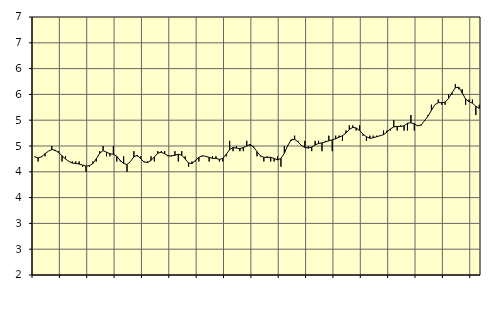
| Category | Piggar | Personliga och kulturella tjänster, SNI 90-98 |
|---|---|---|
| nan | 4.3 | 4.29 |
| 87.0 | 4.2 | 4.27 |
| 87.0 | 4.3 | 4.29 |
| 87.0 | 4.3 | 4.35 |
| nan | 4.4 | 4.4 |
| 88.0 | 4.5 | 4.43 |
| 88.0 | 4.4 | 4.42 |
| 88.0 | 4.4 | 4.37 |
| nan | 4.2 | 4.31 |
| 89.0 | 4.3 | 4.25 |
| 89.0 | 4.2 | 4.2 |
| 89.0 | 4.2 | 4.17 |
| nan | 4.2 | 4.16 |
| 90.0 | 4.2 | 4.15 |
| 90.0 | 4.1 | 4.13 |
| 90.0 | 4 | 4.11 |
| nan | 4.1 | 4.12 |
| 91.0 | 4.2 | 4.16 |
| 91.0 | 4.2 | 4.25 |
| 91.0 | 4.4 | 4.36 |
| nan | 4.5 | 4.41 |
| 92.0 | 4.3 | 4.38 |
| 92.0 | 4.3 | 4.35 |
| 92.0 | 4.5 | 4.34 |
| nan | 4.2 | 4.3 |
| 93.0 | 4.2 | 4.22 |
| 93.0 | 4.3 | 4.16 |
| 93.0 | 4 | 4.14 |
| nan | 4.2 | 4.2 |
| 94.0 | 4.4 | 4.29 |
| 94.0 | 4.3 | 4.32 |
| 94.0 | 4.3 | 4.25 |
| nan | 4.2 | 4.19 |
| 95.0 | 4.2 | 4.18 |
| 95.0 | 4.3 | 4.22 |
| 95.0 | 4.2 | 4.29 |
| nan | 4.4 | 4.36 |
| 96.0 | 4.4 | 4.38 |
| 96.0 | 4.4 | 4.35 |
| 96.0 | 4.3 | 4.31 |
| nan | 4.3 | 4.31 |
| 97.0 | 4.4 | 4.32 |
| 97.0 | 4.2 | 4.34 |
| 97.0 | 4.4 | 4.32 |
| nan | 4.3 | 4.25 |
| 98.0 | 4.1 | 4.17 |
| 98.0 | 4.2 | 4.16 |
| 98.0 | 4.2 | 4.22 |
| nan | 4.2 | 4.28 |
| 99.0 | 4.3 | 4.31 |
| 99.0 | 4.3 | 4.3 |
| 99.0 | 4.2 | 4.28 |
| nan | 4.3 | 4.26 |
| 0.0 | 4.3 | 4.26 |
| 0.0 | 4.2 | 4.24 |
| 0.0 | 4.2 | 4.26 |
| nan | 4.3 | 4.34 |
| 1.0 | 4.6 | 4.43 |
| 1.0 | 4.4 | 4.47 |
| 1.0 | 4.5 | 4.46 |
| nan | 4.4 | 4.45 |
| 2.0 | 4.4 | 4.47 |
| 2.0 | 4.6 | 4.5 |
| 2.0 | 4.5 | 4.53 |
| nan | 4.5 | 4.48 |
| 3.0 | 4.3 | 4.39 |
| 3.0 | 4.3 | 4.31 |
| 3.0 | 4.2 | 4.28 |
| nan | 4.3 | 4.28 |
| 4.0 | 4.2 | 4.28 |
| 4.0 | 4.2 | 4.26 |
| 4.0 | 4.3 | 4.23 |
| nan | 4.1 | 4.26 |
| 5.0 | 4.5 | 4.36 |
| 5.0 | 4.5 | 4.51 |
| 5.0 | 4.6 | 4.62 |
| nan | 4.7 | 4.63 |
| 6.0 | 4.6 | 4.58 |
| 6.0 | 4.5 | 4.51 |
| 6.0 | 4.6 | 4.47 |
| nan | 4.5 | 4.46 |
| 7.0 | 4.4 | 4.48 |
| 7.0 | 4.6 | 4.52 |
| 7.0 | 4.6 | 4.55 |
| nan | 4.4 | 4.56 |
| 8.0 | 4.6 | 4.58 |
| 8.0 | 4.7 | 4.6 |
| 8.0 | 4.4 | 4.62 |
| nan | 4.7 | 4.64 |
| 9.0 | 4.7 | 4.67 |
| 9.0 | 4.6 | 4.7 |
| 9.0 | 4.8 | 4.75 |
| nan | 4.9 | 4.82 |
| 10.0 | 4.9 | 4.86 |
| 10.0 | 4.8 | 4.85 |
| 10.0 | 4.9 | 4.8 |
| nan | 4.7 | 4.73 |
| 11.0 | 4.6 | 4.68 |
| 11.0 | 4.7 | 4.65 |
| 11.0 | 4.7 | 4.66 |
| nan | 4.7 | 4.68 |
| 12.0 | 4.7 | 4.7 |
| 12.0 | 4.8 | 4.72 |
| 12.0 | 4.8 | 4.77 |
| nan | 4.8 | 4.83 |
| 13.0 | 5 | 4.87 |
| 13.0 | 4.8 | 4.88 |
| 13.0 | 4.9 | 4.88 |
| nan | 4.8 | 4.89 |
| 14.0 | 4.8 | 4.94 |
| 14.0 | 5.1 | 4.95 |
| 14.0 | 4.8 | 4.93 |
| nan | 4.9 | 4.89 |
| 15.0 | 4.9 | 4.91 |
| 15.0 | 5 | 4.99 |
| 15.0 | 5.1 | 5.08 |
| nan | 5.3 | 5.19 |
| 16.0 | 5.3 | 5.3 |
| 16.0 | 5.4 | 5.34 |
| 16.0 | 5.3 | 5.34 |
| nan | 5.3 | 5.35 |
| 17.0 | 5.5 | 5.42 |
| 17.0 | 5.5 | 5.53 |
| 17.0 | 5.7 | 5.63 |
| nan | 5.6 | 5.64 |
| 18.0 | 5.6 | 5.53 |
| 18.0 | 5.3 | 5.41 |
| 18.0 | 5.4 | 5.36 |
| nan | 5.4 | 5.33 |
| 19.0 | 5.1 | 5.27 |
| 19.0 | 5.3 | 5.23 |